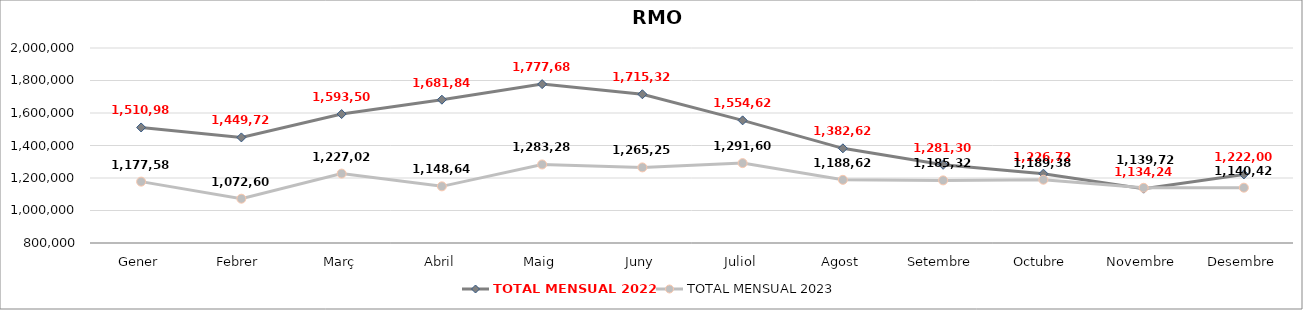
| Category | TOTAL MENSUAL 2022 | TOTAL MENSUAL 2023 |
|---|---|---|
| Gener | 1510980 | 1177580 |
| Febrer | 1449720 | 1072600 |
| Març | 1593500 | 1227020 |
| Abril | 1681840 | 1148640 |
| Maig | 1777689 | 1283280 |
| Juny | 1715320 | 1265250 |
| Juliol | 1554620 | 1291600 |
| Agost | 1382620 | 1188620 |
| Setembre | 1281300 | 1185320 |
| Octubre | 1226720 | 1189380 |
| Novembre | 1134240 | 1139720 |
| Desembre | 1222000 | 1140420 |